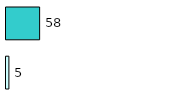
| Category | Series 0 | Series 1 |
|---|---|---|
| 0 | 5 | 58 |